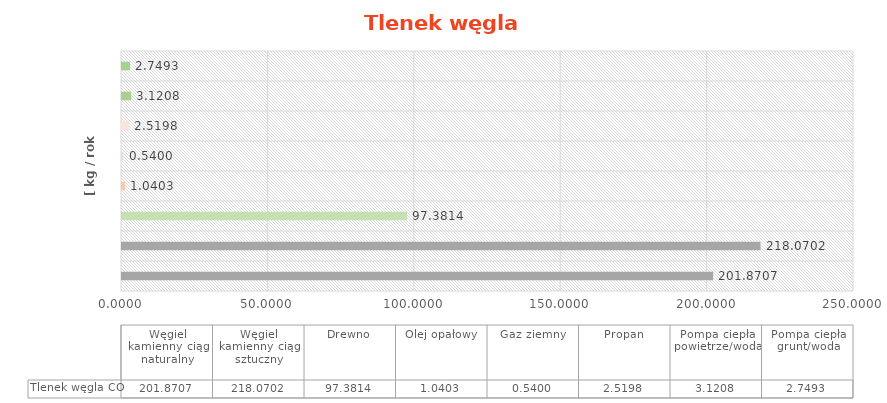
| Category | Tlenek węgla |
|---|---|
| Węgiel kamienny ciąg naturalny | 201.871 |
| Węgiel kamienny ciąg sztuczny | 218.07 |
| Drewno | 97.381 |
| Olej opałowy | 1.04 |
| Gaz ziemny | 0.54 |
| Propan | 2.52 |
| Pompa ciepła powietrze/woda | 3.121 |
| Pompa ciepła grunt/woda | 2.749 |